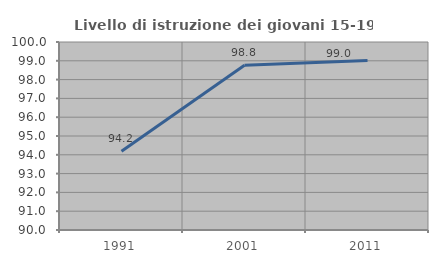
| Category | Livello di istruzione dei giovani 15-19 anni |
|---|---|
| 1991.0 | 94.191 |
| 2001.0 | 98.765 |
| 2011.0 | 99.01 |